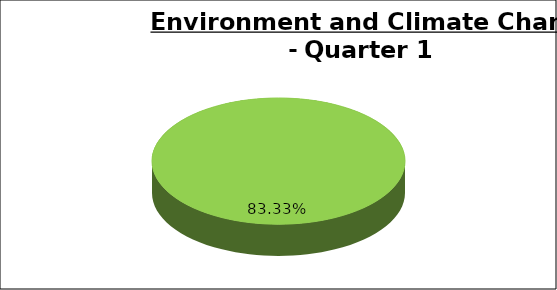
| Category | Green | Amber | Red |
|---|---|---|---|
| Q1 | 0.833 | 0.167 | 0 |